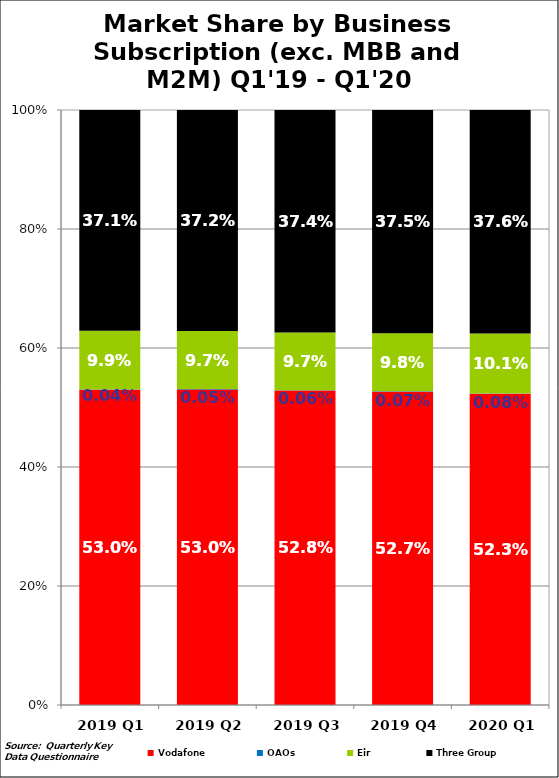
| Category | Vodafone | OAOs | Eir  | Three Group |
|---|---|---|---|---|
| 2019 Q1 | 0.53 | 0 | 0.099 | 0.371 |
| 2019 Q2 | 0.53 | 0.001 | 0.097 | 0.372 |
| 2019 Q3 | 0.528 | 0.001 | 0.097 | 0.374 |
| 2019 Q4 | 0.527 | 0.001 | 0.098 | 0.375 |
| 2020 Q1 | 0.523 | 0.001 | 0.101 | 0.376 |